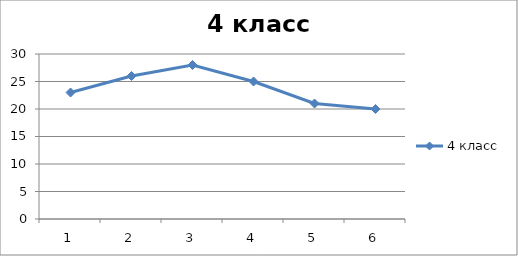
| Category | 4 класс |
|---|---|
| 0 | 23 |
| 1 | 26 |
| 2 | 28 |
| 3 | 25 |
| 4 | 21 |
| 5 | 20 |